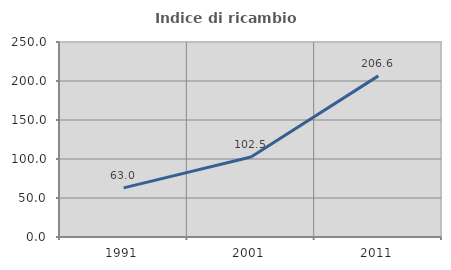
| Category | Indice di ricambio occupazionale  |
|---|---|
| 1991.0 | 62.954 |
| 2001.0 | 102.482 |
| 2011.0 | 206.573 |